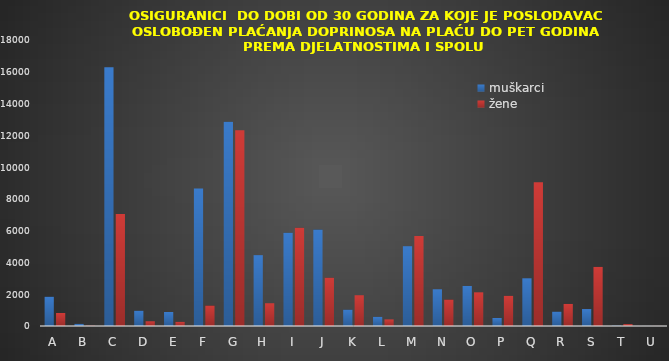
| Category | muškarci | žene |
|---|---|---|
| A | 1842 | 818 |
| B | 132 | 19 |
| C | 16278 | 7052 |
| D | 962 | 297 |
| E | 881 | 262 |
| F | 8655 | 1289 |
| G | 12852 | 12326 |
| H | 4459 | 1433 |
| I | 5871 | 6184 |
| J | 6072 | 3041 |
| K | 1028 | 1936 |
| L | 575 | 416 |
| M | 5021 | 5658 |
| N | 2312 | 1666 |
| O | 2520 | 2120 |
| P | 504 | 1898 |
| Q | 3002 | 9045 |
| R | 904 | 1389 |
| S | 1067 | 3720 |
| T | 20 | 120 |
| U | 3 | 5 |